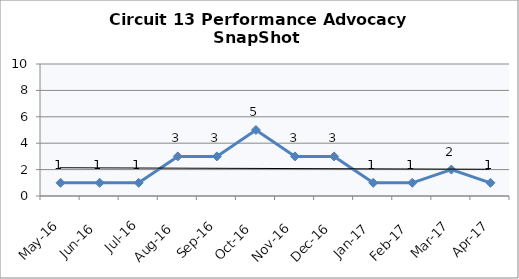
| Category | Circuit 13 |
|---|---|
| May-16 | 1 |
| Jun-16 | 1 |
| Jul-16 | 1 |
| Aug-16 | 3 |
| Sep-16 | 3 |
| Oct-16 | 5 |
| Nov-16 | 3 |
| Dec-16 | 3 |
| Jan-17 | 1 |
| Feb-17 | 1 |
| Mar-17 | 2 |
| Apr-17 | 1 |